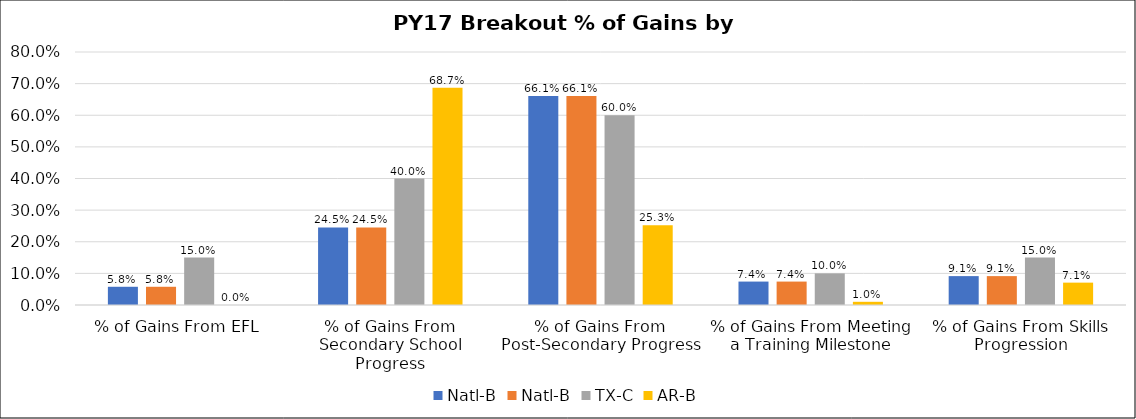
| Category | Natl-B | TX-C | AR-B |
|---|---|---|---|
| % of Gains From EFL | 0.058 | 0.15 | 0 |
| % of Gains From Secondary School Progress | 0.245 | 0.4 | 0.687 |
| % of Gains From Post-Secondary Progress | 0.661 | 0.6 | 0.253 |
| % of Gains From Meeting a Training Milestone | 0.074 | 0.1 | 0.01 |
| % of Gains From Skills Progression | 0.091 | 0.15 | 0.071 |